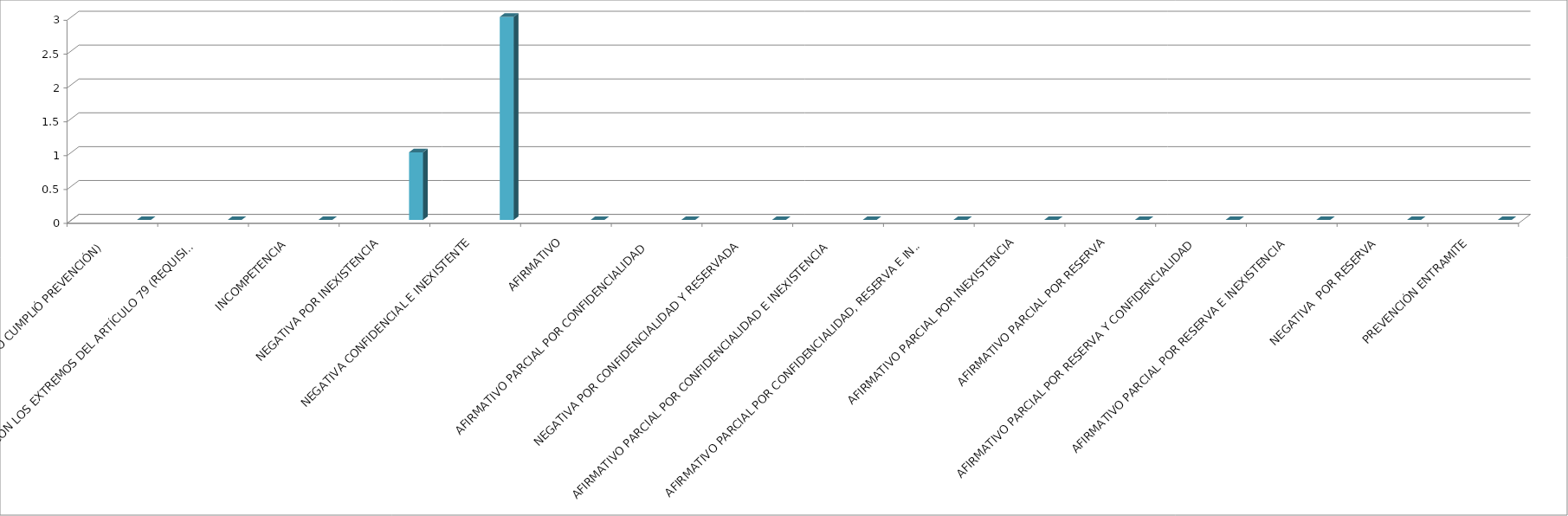
| Category | Series 0 | Series 1 | Series 2 | Series 3 | Series 4 |
|---|---|---|---|---|---|
| SE TIENE POR NO PRESENTADA ( NO CUMPLIÓ PREVENCIÓN) |  |  |  |  | 0 |
| NO CUMPLIO CON LOS EXTREMOS DEL ARTÍCULO 79 (REQUISITOS) |  |  |  |  | 0 |
| INCOMPETENCIA  |  |  |  |  | 0 |
| NEGATIVA POR INEXISTENCIA |  |  |  |  | 1 |
| NEGATIVA CONFIDENCIAL E INEXISTENTE |  |  |  |  | 3 |
| AFIRMATIVO |  |  |  |  | 0 |
| AFIRMATIVO PARCIAL POR CONFIDENCIALIDAD  |  |  |  |  | 0 |
| NEGATIVA POR CONFIDENCIALIDAD Y RESERVADA |  |  |  |  | 0 |
| AFIRMATIVO PARCIAL POR CONFIDENCIALIDAD E INEXISTENCIA |  |  |  |  | 0 |
| AFIRMATIVO PARCIAL POR CONFIDENCIALIDAD, RESERVA E INEXISTENCIA |  |  |  |  | 0 |
| AFIRMATIVO PARCIAL POR INEXISTENCIA |  |  |  |  | 0 |
| AFIRMATIVO PARCIAL POR RESERVA |  |  |  |  | 0 |
| AFIRMATIVO PARCIAL POR RESERVA Y CONFIDENCIALIDAD |  |  |  |  | 0 |
| AFIRMATIVO PARCIAL POR RESERVA E INEXISTENCIA |  |  |  |  | 0 |
| NEGATIVA  POR RESERVA |  |  |  |  | 0 |
| PREVENCIÓN ENTRAMITE |  |  |  |  | 0 |